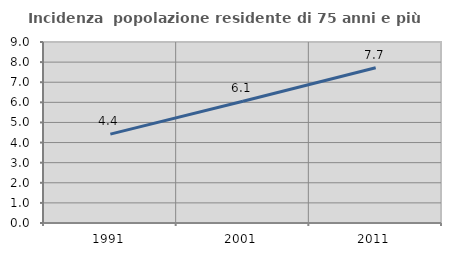
| Category | Incidenza  popolazione residente di 75 anni e più |
|---|---|
| 1991.0 | 4.419 |
| 2001.0 | 6.05 |
| 2011.0 | 7.721 |